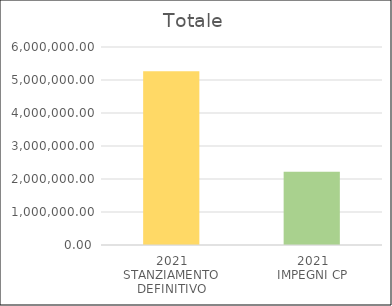
| Category | Series 0 |
|---|---|
| 2021
STANZIAMENTO DEFINITIVO | 5268151.83 |
| 2021
IMPEGNI CP | 2221070.08 |